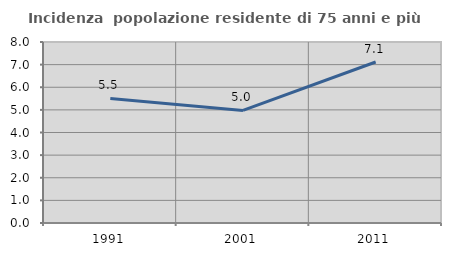
| Category | Incidenza  popolazione residente di 75 anni e più |
|---|---|
| 1991.0 | 5.505 |
| 2001.0 | 4.974 |
| 2011.0 | 7.116 |